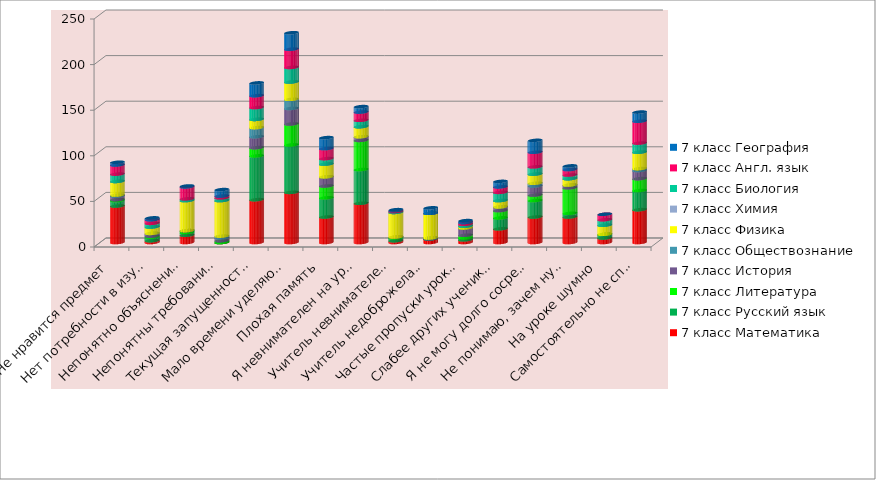
| Category | 7 класс Математика | 7 класс Русский язык | 7 класс Литература | 7 класс История | 7 класс Обществознание | 7 класс Физика | 7 класс Химия | 7 класс Биология | 7 класс Англ. язык | 7 класс География |
|---|---|---|---|---|---|---|---|---|---|---|
| Не нравится предмет | 40 | 6 | 1 | 4 | 1 | 15 | 0 | 8 | 10 | 3 |
| Нет потребности в изучении предмета | 2 | 4 | 1 | 3 | 0 | 7 | 0 | 4 | 4 | 2 |
| Непонятно объяснение учителя | 8 | 3 | 2 | 0 | 0 | 33 | 0 | 2 | 13 | 1 |
| Непонятны требования учителя | 0 | 0 | 2 | 3 | 2 | 39 | 0 | 3 | 2 | 7 |
| Текущая запущенность материала из-за лени | 47 | 48 | 9 | 12 | 10 | 9 | 0 | 13 | 13 | 14 |
| Мало времени уделяю выполнению д/з | 55 | 52 | 23 | 17 | 10 | 19 | 0 | 16 | 20 | 18 |
| Плохая память | 28 | 21 | 13 | 10 | 0 | 14 | 0 | 6 | 11 | 12 |
| Я невнимателен на уроке | 43 | 37 | 32 | 4 | 0 | 11 | 0 | 7 | 9 | 6 |
| Учитель невнимателен  ко мне | 2 | 3 | 1 | 0 | 0 | 27 | 0 | 1 | 1 | 1 |
| Учитель недоброжелателен ко мне | 4 | 0 | 0 | 1 | 0 | 27 | 0 | 0 | 0 | 6 |
| Частые пропуски уроков | 3 | 2 | 3 | 8 | 0 | 2 | 0 | 2 | 2 | 2 |
| Слабее других учеников в классе | 15 | 12 | 8 | 4 | 0 | 7 | 0 | 9 | 6 | 6 |
| Я не могу долго сосредоточивать внимание | 28 | 18 | 6 | 10 | 3 | 10 | 0 | 8 | 16 | 13 |
| Не понимаю, зачем нужны  эти знания | 28 | 4 | 28 | 3 | 0 | 7 | 0 | 4 | 6 | 4 |
| На уроке шумно | 5 | 4 | 0 | 0 | 0 | 10 | 0 | 6 | 6 | 0 |
| Самостоятельно не справляюсь  – нужна помощь  | 36 | 21 | 13 | 9 | 2 | 18 | 0 | 10 | 24 | 10 |